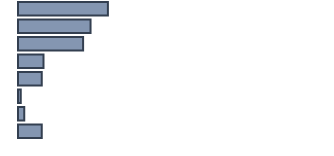
| Category | Series 0 |
|---|---|
| 0 | 29 |
| 1 | 23.4 |
| 2 | 21 |
| 3 | 8.2 |
| 4 | 7.7 |
| 5 | 0.9 |
| 6 | 2 |
| 7 | 7.7 |